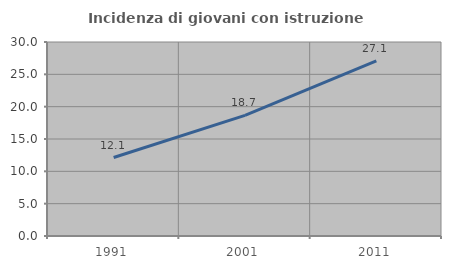
| Category | Incidenza di giovani con istruzione universitaria |
|---|---|
| 1991.0 | 12.135 |
| 2001.0 | 18.66 |
| 2011.0 | 27.069 |